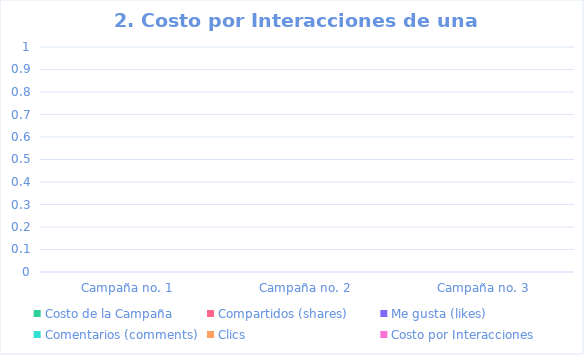
| Category | Costo de la Campaña | Compartidos (shares) | Me gusta (likes) | Comentarios (comments) | Clics | Costo por Interacciones |
|---|---|---|---|---|---|---|
| Campaña no. 1 |  |  |  |  |  | 0 |
| Campaña no. 2 |  |  |  |  |  | 0 |
| Campaña no. 3 |  |  |  |  |  | 0 |